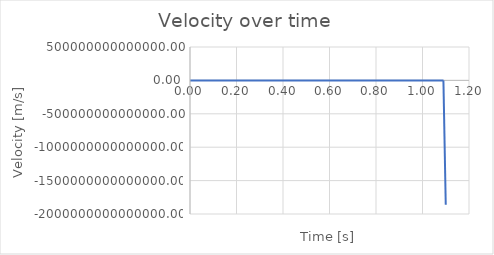
| Category | Series 0 |
|---|---|
| 0.0 | 500 |
| 0.01 | 494.135 |
| 0.02 | 447.713 |
| 0.03 | 347.486 |
| 0.04 | 232.475 |
| 0.05 | 148.992 |
| 0.060000000000000005 | 98.624 |
| 0.07 | 73.258 |
| 0.08 | 57.612 |
| 0.09 | 47.062 |
| 0.09999999999999999 | 39.565 |
| 0.10999999999999999 | 34.053 |
| 0.11999999999999998 | 29.904 |
| 0.12999999999999998 | 26.729 |
| 0.13999999999999999 | 24.273 |
| 0.15 | 22.361 |
| 0.16 | 20.868 |
| 0.17 | 19.701 |
| 0.18000000000000002 | 18.792 |
| 0.19000000000000003 | 18.087 |
| 0.20000000000000004 | 17.544 |
| 0.21000000000000005 | 17.129 |
| 0.22000000000000006 | 16.816 |
| 0.23000000000000007 | 16.581 |
| 0.24000000000000007 | 16.409 |
| 0.25000000000000006 | 16.284 |
| 0.26000000000000006 | 16.194 |
| 0.2700000000000001 | 16.131 |
| 0.2800000000000001 | 16.088 |
| 0.2900000000000001 | 16.058 |
| 0.3000000000000001 | 16.039 |
| 0.3100000000000001 | 16.026 |
| 0.3200000000000001 | 16.017 |
| 0.3300000000000001 | 16.012 |
| 0.34000000000000014 | 16.009 |
| 0.35000000000000014 | 16.007 |
| 0.36000000000000015 | 16.005 |
| 0.37000000000000016 | 16.005 |
| 0.38000000000000017 | 16.004 |
| 0.3900000000000002 | 16.004 |
| 0.4000000000000002 | 16.003 |
| 0.4100000000000002 | 16.003 |
| 0.4200000000000002 | 16.003 |
| 0.4300000000000002 | 16.003 |
| 0.4400000000000002 | 16.003 |
| 0.45000000000000023 | 16.003 |
| 0.46000000000000024 | 16.002 |
| 0.47000000000000025 | 16.002 |
| 0.48000000000000026 | 16.002 |
| 0.49000000000000027 | 16.002 |
| 0.5000000000000002 | 16.002 |
| 0.5100000000000002 | 16.002 |
| 0.5200000000000002 | 16.001 |
| 0.5300000000000002 | 16.001 |
| 0.5400000000000003 | 16.001 |
| 0.5500000000000003 | 16.001 |
| 0.5600000000000003 | 14.971 |
| 0.5700000000000003 | 13.832 |
| 0.5800000000000003 | 12.878 |
| 0.5900000000000003 | 12.104 |
| 0.6000000000000003 | 11.464 |
| 0.6100000000000003 | 10.92 |
| 0.6200000000000003 | 10.45 |
| 0.6300000000000003 | 10.039 |
| 0.6400000000000003 | 9.674 |
| 0.6500000000000004 | 9.348 |
| 0.6600000000000004 | 9.054 |
| 0.6700000000000004 | 8.786 |
| 0.6800000000000004 | 8.542 |
| 0.6900000000000004 | 8.317 |
| 0.7000000000000004 | 8.109 |
| 0.7100000000000004 | 7.917 |
| 0.7200000000000004 | 7.738 |
| 0.7300000000000004 | 7.57 |
| 0.7400000000000004 | 7.414 |
| 0.7500000000000004 | 7.267 |
| 0.7600000000000005 | 7.128 |
| 0.7700000000000005 | 6.997 |
| 0.7800000000000005 | 6.873 |
| 0.7900000000000005 | 6.756 |
| 0.8000000000000005 | 6.644 |
| 0.8100000000000005 | 6.538 |
| 0.8200000000000005 | 6.437 |
| 0.8300000000000005 | 6.341 |
| 0.8400000000000005 | 6.248 |
| 0.8500000000000005 | 6.16 |
| 0.8600000000000005 | 6.075 |
| 0.8700000000000006 | 5.994 |
| 0.8800000000000006 | 5.916 |
| 0.8900000000000006 | 5.841 |
| 0.9000000000000006 | 5.769 |
| 0.9100000000000006 | 5.699 |
| 0.9200000000000006 | 5.632 |
| 0.9300000000000006 | 5.567 |
| 0.9400000000000006 | 5.505 |
| 0.9500000000000006 | 5.444 |
| 0.9600000000000006 | 5.386 |
| 0.9700000000000006 | 5.329 |
| 0.9800000000000006 | 5.274 |
| 0.9900000000000007 | 5.221 |
| 1.0000000000000007 | 5.169 |
| 1.0100000000000007 | 5.314 |
| 1.0200000000000007 | 4.901 |
| 1.0300000000000007 | 6.055 |
| 1.0400000000000007 | 2.464 |
| 1.0500000000000007 | 10.458 |
| 1.0600000000000007 | -21.089 |
| 1.0700000000000007 | -182.767 |
| 1.0800000000000007 | -13224.126 |
| 1.0900000000000007 | -68960205.862 |
| 1.1000000000000008 | -1861083012359927.2 |